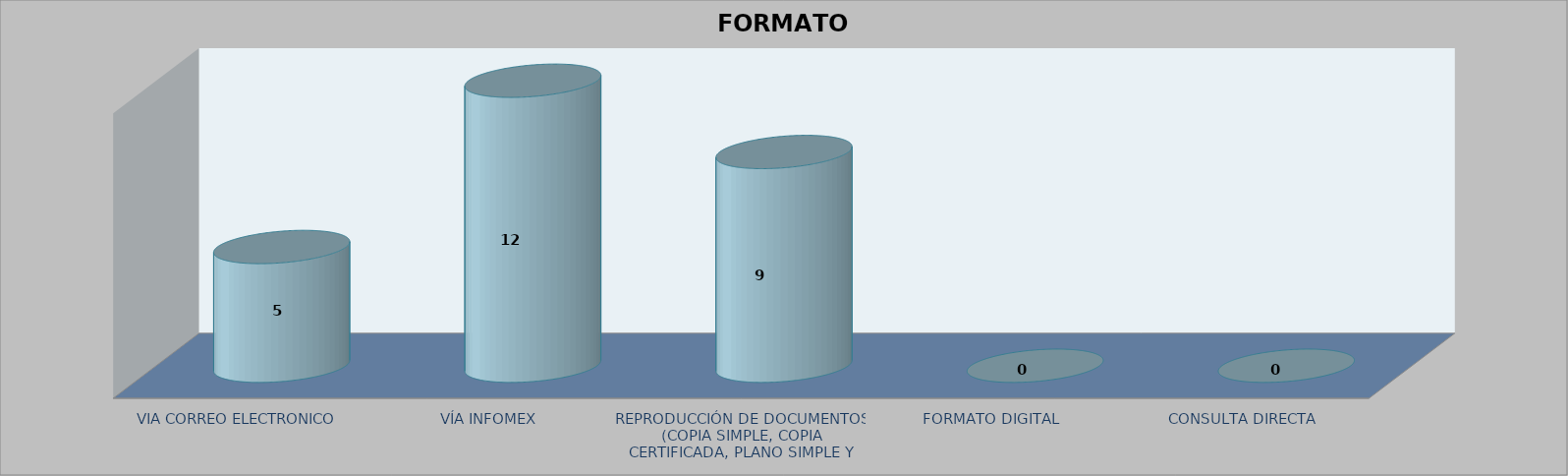
| Category |        FORMATO SOLICITADO | Series 1 | Series 2 |
|---|---|---|---|
| VIA CORREO ELECTRONICO |  |  | 5 |
| VÍA INFOMEX |  |  | 12 |
| REPRODUCCIÓN DE DOCUMENTOS (COPIA SIMPLE, COPIA CERTIFICADA, PLANO SIMPLE Y PLANO CERTIFICADO) |  |  | 9 |
| FORMATO DIGITAL |  |  | 0 |
| CONSULTA DIRECTA |  |  | 0 |